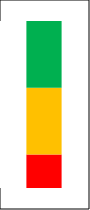
| Category | Series 0 | Series 1 | Series 2 |
|---|---|---|---|
| Summe 1 -10 | 0.2 | 0.4 | 0.4 |